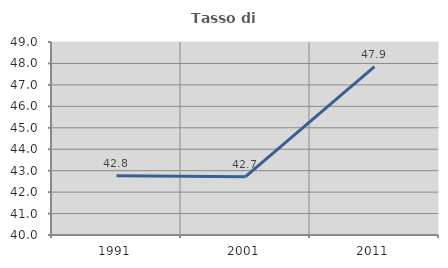
| Category | Tasso di occupazione   |
|---|---|
| 1991.0 | 42.761 |
| 2001.0 | 42.72 |
| 2011.0 | 47.854 |